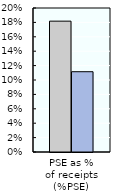
| Category | 2000-02 | 2018-20 |
|---|---|---|
| PSE as %
of receipts (%PSE) | 0.182 | 0.112 |